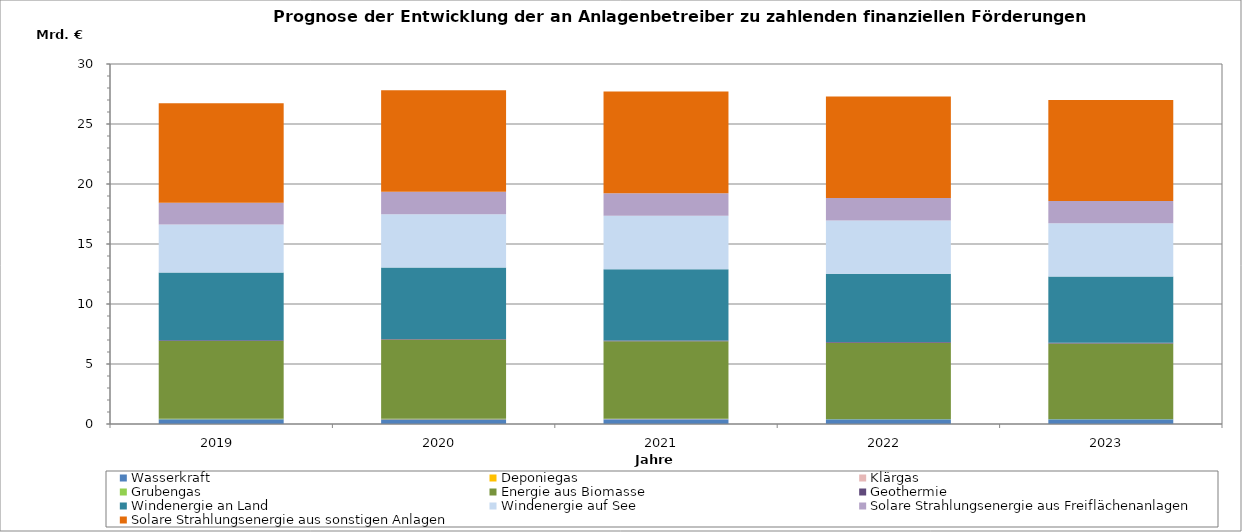
| Category | Wasserkraft | Deponiegas | Klärgas | Grubengas | Energie aus Biomasse | Geothermie | Windenergie an Land | Windenergie auf See | Solare Strahlungsenergie aus Freiflächenanlagen | Solare Strahlungsenergie aus sonstigen Anlagen |
|---|---|---|---|---|---|---|---|---|---|---|
| 2019.0 | 387.587 | 14.222 | 3.565 | 25.556 | 6492.802 | 48.473 | 5655.509 | 3992.338 | 1809.545 | 8298.219 |
| 2020.0 | 396.123 | 13.38 | 3.567 | 25.986 | 6596.413 | 52.897 | 5944.181 | 4456.226 | 1861.107 | 8456.295 |
| 2021.0 | 398.684 | 7.11 | 1.834 | 21.053 | 6476.819 | 56.73 | 5924.409 | 4465.171 | 1875.336 | 8489.964 |
| 2022.0 | 394.511 | 5.121 | 1.466 | 18.262 | 6354.908 | 59.969 | 5686.013 | 4439.918 | 1863.78 | 8475.359 |
| 2023.0 | 393.267 | 4.498 | 1.405 | 11.293 | 6291.475 | 63.131 | 5519.043 | 4441.173 | 1854.097 | 8421.155 |